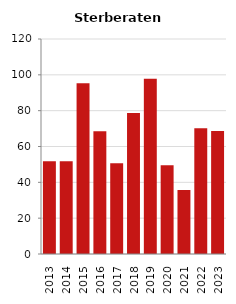
| Category | Sterberate der Bevölkerung ab 80 Jahre (auf Tsd.) |
|---|---|
| 2013.0 | 51.724 |
| 2014.0 | 51.724 |
| 2015.0 | 95.238 |
| 2016.0 | 68.493 |
| 2017.0 | 50.633 |
| 2018.0 | 78.652 |
| 2019.0 | 97.826 |
| 2020.0 | 49.505 |
| 2021.0 | 35.714 |
| 2022.0 | 70.175 |
| 2023.0 | 68.702 |